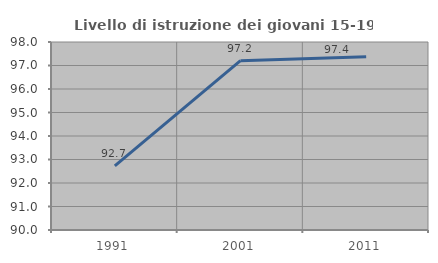
| Category | Livello di istruzione dei giovani 15-19 anni |
|---|---|
| 1991.0 | 92.727 |
| 2001.0 | 97.207 |
| 2011.0 | 97.368 |